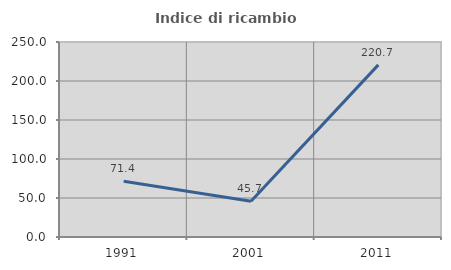
| Category | Indice di ricambio occupazionale  |
|---|---|
| 1991.0 | 71.429 |
| 2001.0 | 45.745 |
| 2011.0 | 220.69 |